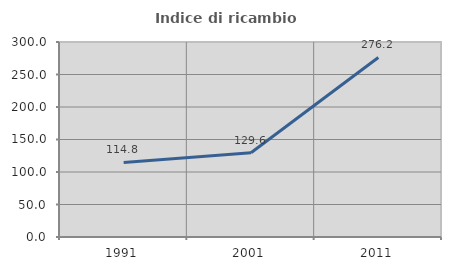
| Category | Indice di ricambio occupazionale  |
|---|---|
| 1991.0 | 114.793 |
| 2001.0 | 129.57 |
| 2011.0 | 276.171 |